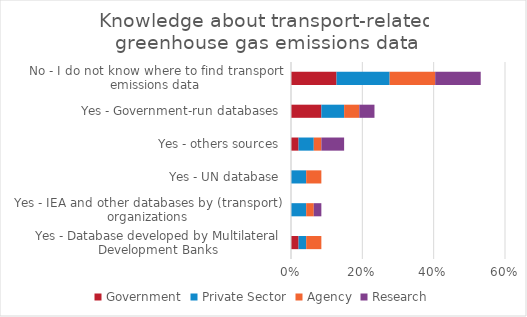
| Category | Government | Private Sector | Agency | Research |
|---|---|---|---|---|
| Yes - Database developed by Multilateral Development Banks | 0.021 | 0.021 | 0.043 | 0 |
| Yes - IEA and other databases by (transport) organizations | 0 | 0.043 | 0.021 | 0.021 |
| Yes - UN database | 0 | 0.043 | 0.043 | 0 |
| Yes - others sources | 0.021 | 0.043 | 0.021 | 0.064 |
| Yes - Government-run databases | 0.085 | 0.064 | 0.043 | 0.043 |
| No - I do not know where to find transport emissions data | 0.128 | 0.149 | 0.128 | 0.128 |